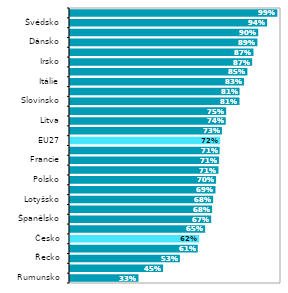
| Category | Series 0 |
|---|---|
| Rumunsko | 0.329 |
| Bulharsko | 0.446 |
| Řecko | 0.525 |
| Slovensko | 0.61 |
| Česko | 0.617 |
| Maďarsko | 0.645 |
| Španělsko | 0.674 |
| Chorvatsko | 0.678 |
| Lotyšsko | 0.683 |
| Lucembursko | 0.694 |
| Polsko | 0.697 |
| Německo | 0.708 |
| Francie | 0.711 |
| Portugalsko | 0.714 |
| EU27 | 0.716 |
| Malta | 0.725 |
| Litva | 0.743 |
| Rakousko | 0.745 |
| Slovinsko | 0.808 |
| Estonsko | 0.808 |
| Itálie | 0.83 |
| Kypr | 0.845 |
| Irsko | 0.868 |
| Nizozemsko | 0.874 |
| Dánsko | 0.893 |
| Belgie | 0.897 |
| Švédsko | 0.939 |
| Finsko | 0.988 |